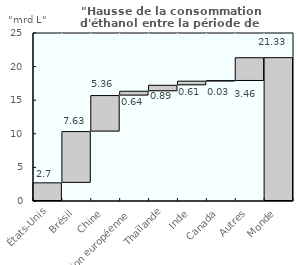
| Category | Series 1 | Series 0 |
|---|---|---|
| États-Unis | 0 | 2.7 |
| Brésil | 2.7 | 7.63 |
| Chine | 10.33 | 5.36 |
| Union européenne | 15.69 | 0.64 |
| Thaïlande | 16.33 | 0.89 |
| Inde | 17.22 | 0.61 |
| Canada | 17.83 | 0.03 |
| Autres | 17.86 | 3.46 |
| Monde | 0 | 21.33 |